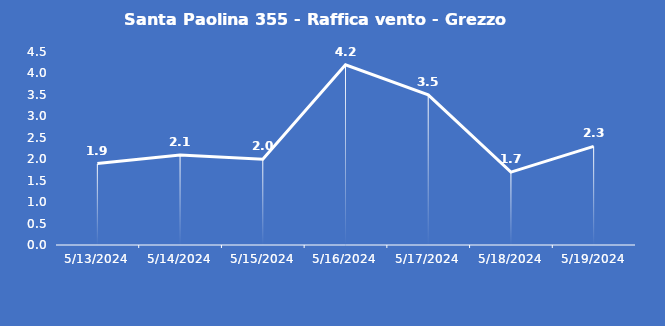
| Category | Santa Paolina 355 - Raffica vento - Grezzo (m/s) |
|---|---|
| 5/13/24 | 1.9 |
| 5/14/24 | 2.1 |
| 5/15/24 | 2 |
| 5/16/24 | 4.2 |
| 5/17/24 | 3.5 |
| 5/18/24 | 1.7 |
| 5/19/24 | 2.3 |